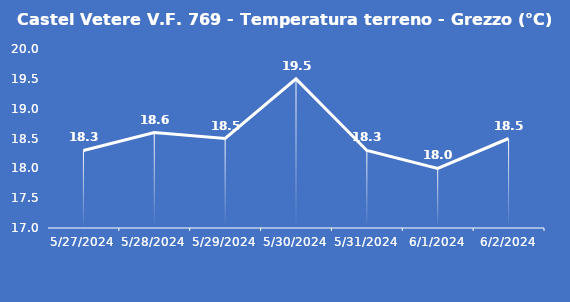
| Category | Castel Vetere V.F. 769 - Temperatura terreno - Grezzo (°C) |
|---|---|
| 5/27/24 | 18.3 |
| 5/28/24 | 18.6 |
| 5/29/24 | 18.5 |
| 5/30/24 | 19.5 |
| 5/31/24 | 18.3 |
| 6/1/24 | 18 |
| 6/2/24 | 18.5 |